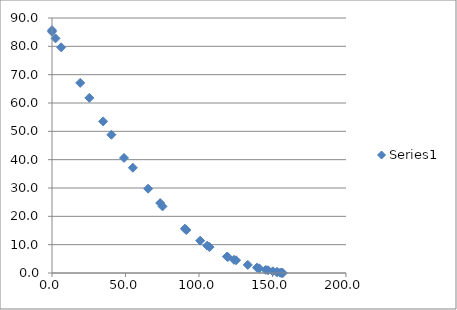
| Category | Series 0 |
|---|---|
| 0.0 | 85.7 |
| 0.0 | 85.15 |
| 2.4 | 82.8 |
| 6.2 | 79.65 |
| 19.2 | 67.1 |
| 25.4 | 61.8 |
| 34.8 | 53.5 |
| 40.4 | 48.8 |
| 48.99999999999999 | 40.6 |
| 55.0 | 37.15 |
| 65.4 | 29.75 |
| 73.6 | 24.7 |
| 75.19999999999999 | 23.5 |
| 90.39999999999999 | 15.65 |
| 91.4 | 15.15 |
| 100.8 | 11.4 |
| 105.60000000000001 | 9.65 |
| 107.2 | 9.15 |
| 118.99999999999999 | 5.8 |
| 119.6 | 5.65 |
| 123.79999999999998 | 4.65 |
| 125.19999999999999 | 4.5 |
| 133.2 | 2.85 |
| 139.39999999999998 | 1.9 |
| 140.99999999999997 | 1.65 |
| 145.39999999999998 | 1.1 |
| 147.0 | 0.95 |
| 150.2 | 0.6 |
| 153.0 | 0.35 |
| 153.2 | 0.3 |
| 155.2 | 0.1 |
| 156.2 | 0.05 |
| 156.2 | 0.05 |
| 157.0 | 0 |